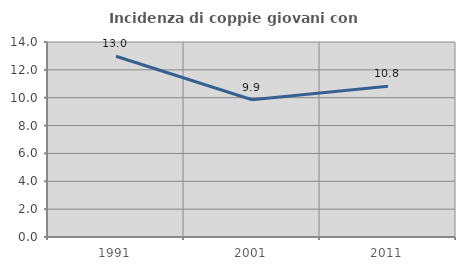
| Category | Incidenza di coppie giovani con figli |
|---|---|
| 1991.0 | 12.975 |
| 2001.0 | 9.851 |
| 2011.0 | 10.819 |